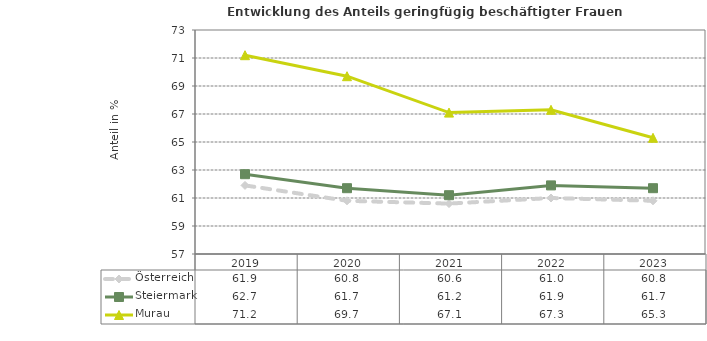
| Category | Österreich | Steiermark | Murau |
|---|---|---|---|
| 2023.0 | 60.8 | 61.7 | 65.3 |
| 2022.0 | 61 | 61.9 | 67.3 |
| 2021.0 | 60.6 | 61.2 | 67.1 |
| 2020.0 | 60.8 | 61.7 | 69.7 |
| 2019.0 | 61.9 | 62.7 | 71.2 |